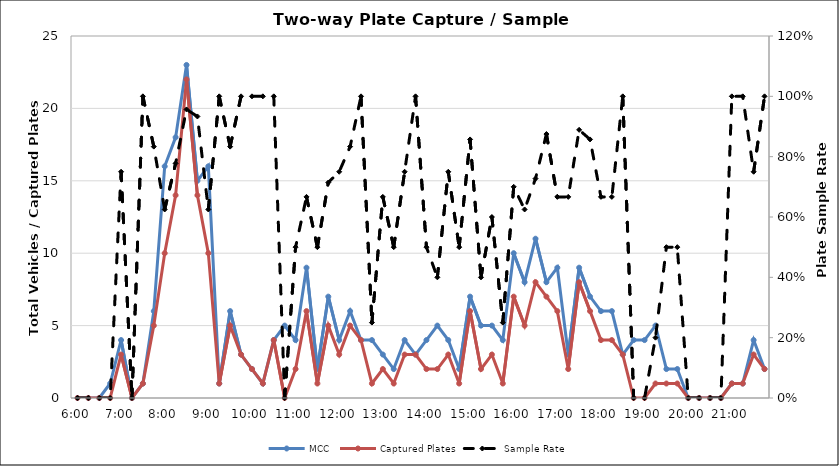
| Category | MCC | Captured Plates |
|---|---|---|
| 0.25 | 0 | 0 |
| 0.260416666666667 | 0 | 0 |
| 0.270833333333333 | 0 | 0 |
| 0.28125 | 1 | 0 |
| 0.291666666666667 | 4 | 3 |
| 0.302083333333333 | 0 | 0 |
| 0.3125 | 1 | 1 |
| 0.322916666666667 | 6 | 5 |
| 0.333333333333333 | 16 | 10 |
| 0.34375 | 18 | 14 |
| 0.354166666666667 | 23 | 22 |
| 0.364583333333333 | 15 | 14 |
| 0.375 | 16 | 10 |
| 0.385416666666667 | 1 | 1 |
| 0.395833333333333 | 6 | 5 |
| 0.40625 | 3 | 3 |
| 0.416666666666667 | 2 | 2 |
| 0.427083333333333 | 1 | 1 |
| 0.4375 | 4 | 4 |
| 0.447916666666667 | 5 | 0 |
| 0.458333333333333 | 4 | 2 |
| 0.46875 | 9 | 6 |
| 0.479166666666667 | 2 | 1 |
| 0.489583333333333 | 7 | 5 |
| 0.5 | 4 | 3 |
| 0.510416666666667 | 6 | 5 |
| 0.520833333333333 | 4 | 4 |
| 0.53125 | 4 | 1 |
| 0.541666666666667 | 3 | 2 |
| 0.552083333333333 | 2 | 1 |
| 0.5625 | 4 | 3 |
| 0.572916666666667 | 3 | 3 |
| 0.583333333333333 | 4 | 2 |
| 0.59375 | 5 | 2 |
| 0.604166666666667 | 4 | 3 |
| 0.614583333333333 | 2 | 1 |
| 0.625 | 7 | 6 |
| 0.635416666666667 | 5 | 2 |
| 0.645833333333333 | 5 | 3 |
| 0.65625 | 4 | 1 |
| 0.666666666666667 | 10 | 7 |
| 0.677083333333333 | 8 | 5 |
| 0.6875 | 11 | 8 |
| 0.697916666666667 | 8 | 7 |
| 0.708333333333333 | 9 | 6 |
| 0.71875 | 3 | 2 |
| 0.729166666666667 | 9 | 8 |
| 0.739583333333333 | 7 | 6 |
| 0.75 | 6 | 4 |
| 0.760416666666667 | 6 | 4 |
| 0.770833333333333 | 3 | 3 |
| 0.78125 | 4 | 0 |
| 0.791666666666667 | 4 | 0 |
| 0.802083333333333 | 5 | 1 |
| 0.8125 | 2 | 1 |
| 0.822916666666667 | 2 | 1 |
| 0.833333333333333 | 0 | 0 |
| 0.84375 | 0 | 0 |
| 0.854166666666667 | 0 | 0 |
| 0.864583333333333 | 0 | 0 |
| 0.875 | 1 | 1 |
| 0.885416666666667 | 1 | 1 |
| 0.895833333333333 | 4 | 3 |
| 0.90625 | 2 | 2 |